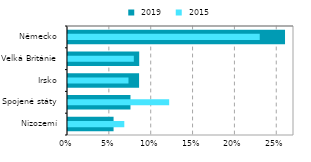
| Category |  2019 |
|---|---|
| Nizozemí | 0.054 |
| Spojené státy | 0.075 |
| Irsko | 0.085 |
| Velká Británie | 0.085 |
| Německo | 0.259 |